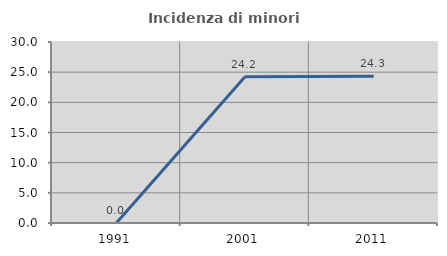
| Category | Incidenza di minori stranieri |
|---|---|
| 1991.0 | 0 |
| 2001.0 | 24.242 |
| 2011.0 | 24.324 |